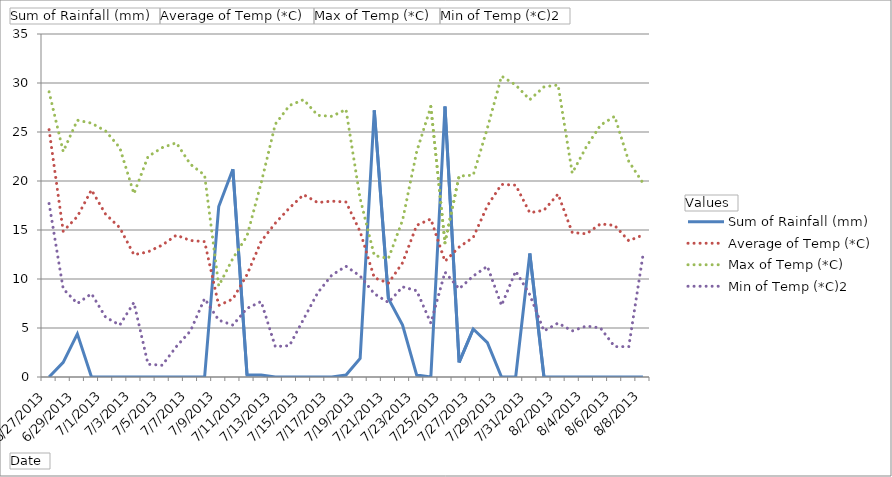
| Category | Sum of Rainfall (mm) | Average of Temp (*C) | Max of Temp (*C) | Min of Temp (*C)2 |
|---|---|---|---|---|
| 6/27/2013 | 0 | 25.24 | 29.1 | 17.7 |
| 6/28/2013 | 1.5 | 14.867 | 23 | 9 |
| 6/29/2013 | 4.4 | 16.375 | 26.2 | 7.5 |
| 6/30/2013 | 0 | 19.092 | 25.9 | 8.5 |
| 7/1/2013 | 0 | 16.608 | 25.1 | 6.1 |
| 7/2/2013 | 0 | 15.233 | 23.4 | 5.3 |
| 7/3/2013 | 0 | 12.479 | 18.7 | 7.6 |
| 7/4/2013 | 0 | 12.771 | 22.5 | 1.3 |
| 7/5/2013 | 0 | 13.458 | 23.4 | 1.2 |
| 7/6/2013 | 0 | 14.471 | 23.9 | 3.1 |
| 7/7/2013 | 0 | 13.929 | 21.7 | 4.7 |
| 7/8/2013 | 0 | 13.812 | 20.6 | 8 |
| 7/9/2013 | 17.4 | 7.304 | 9.3 | 5.8 |
| 7/10/2013 | 21.2 | 7.962 | 12.1 | 5.3 |
| 7/11/2013 | 0.2 | 10.446 | 14.4 | 7 |
| 7/12/2013 | 0.2 | 13.842 | 19.8 | 7.7 |
| 7/13/2013 | 0 | 15.696 | 25.8 | 3.1 |
| 7/14/2013 | 0 | 17.246 | 27.7 | 3.2 |
| 7/15/2013 | 0 | 18.6 | 28.3 | 5.9 |
| 7/16/2013 | 0 | 17.8 | 26.7 | 8.6 |
| 7/17/2013 | 0 | 17.946 | 26.6 | 10.4 |
| 7/18/2013 | 0.2 | 17.854 | 27.3 | 11.3 |
| 7/19/2013 | 1.9 | 14.838 | 18.2 | 10.3 |
| 7/20/2013 | 27.2 | 10.129 | 12.4 | 8.5 |
| 7/21/2013 | 8 | 9.579 | 12.1 | 7.6 |
| 7/22/2013 | 5.3 | 11.654 | 16 | 9.2 |
| 7/23/2013 | 0.2 | 15.475 | 23 | 8.8 |
| 7/24/2013 | 0 | 16.121 | 27.6 | 5.5 |
| 7/25/2013 | 27.6 | 11.808 | 13.7 | 10.7 |
| 7/26/2013 | 1.5 | 13.254 | 20.5 | 9 |
| 7/27/2013 | 4.9 | 14.246 | 20.6 | 10.3 |
| 7/28/2013 | 3.5 | 17.475 | 25.4 | 11.3 |
| 7/29/2013 | 0 | 19.654 | 30.7 | 7.3 |
| 7/30/2013 | 0 | 19.575 | 29.8 | 10.8 |
| 7/31/2013 | 12.6 | 16.758 | 28.3 | 8.4 |
| 8/1/2013 | 0 | 17.017 | 29.6 | 4.7 |
| 8/2/2013 | 0 | 18.667 | 29.8 | 5.5 |
| 8/3/2013 | 0 | 14.746 | 20.8 | 4.7 |
| 8/4/2013 | 0 | 14.608 | 23.5 | 5.2 |
| 8/5/2013 | 0 | 15.621 | 25.7 | 5 |
| 8/6/2013 | 0 | 15.467 | 26.6 | 3.1 |
| 8/7/2013 | 0 | 13.9 | 22 | 3.1 |
| 8/8/2013 | 0 | 14.494 | 19.8 | 12.4 |